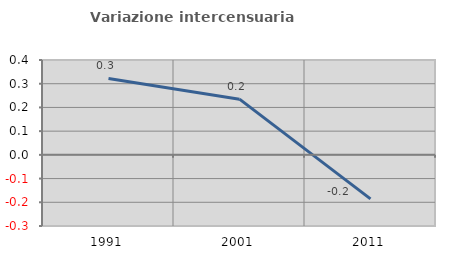
| Category | Variazione intercensuaria annua |
|---|---|
| 1991.0 | 0.322 |
| 2001.0 | 0.235 |
| 2011.0 | -0.185 |